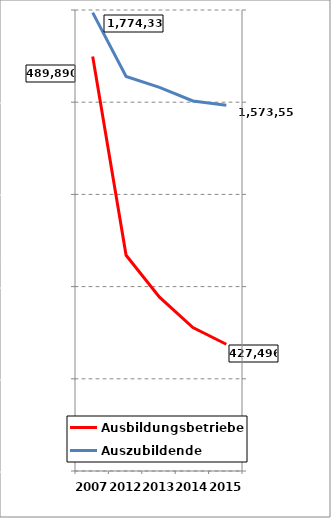
| Category | Ausbildungsbetriebe |
|---|---|
| 2007.0 | 489890 |
| 2012.0 | 446797 |
| 2013.0 | 437721 |
| 2014.0 | 431121 |
| 2015.0 | 427496 |